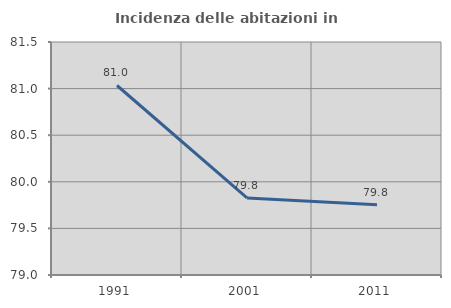
| Category | Incidenza delle abitazioni in proprietà  |
|---|---|
| 1991.0 | 81.033 |
| 2001.0 | 79.827 |
| 2011.0 | 79.753 |